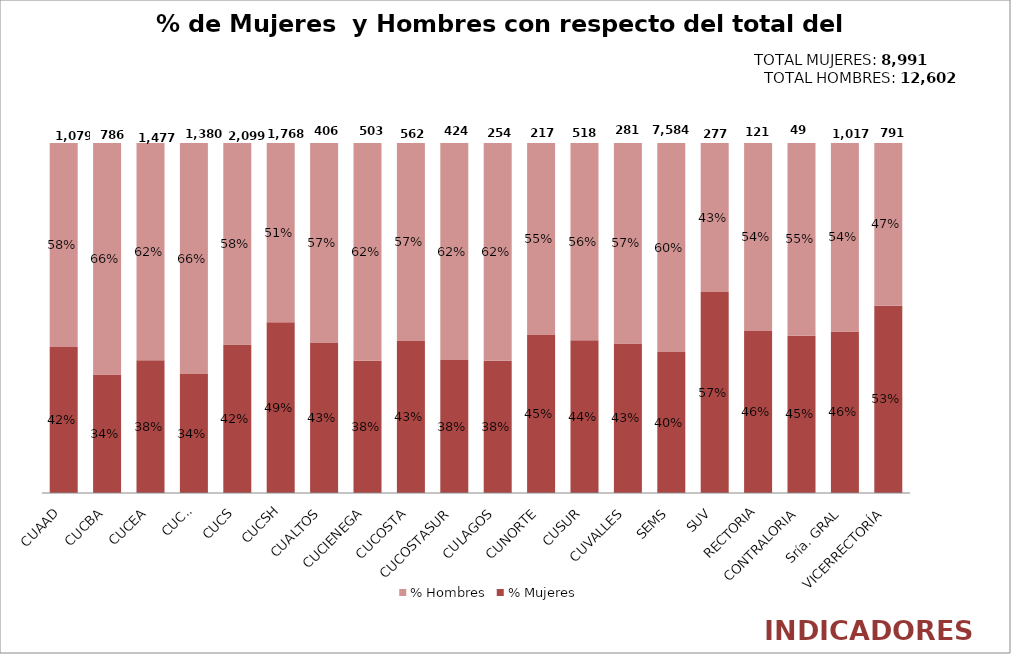
| Category | % Mujeres | % Hombres |
|---|---|---|
| CUAAD | 0.417 | 0.583 |
| CUCBA | 0.338 | 0.662 |
| CUCEA | 0.379 | 0.621 |
| CUCEI | 0.34 | 0.66 |
| CUCS | 0.424 | 0.576 |
| CUCSH | 0.488 | 0.512 |
| CUALTOS | 0.429 | 0.571 |
| CUCIENEGA | 0.378 | 0.622 |
| CUCOSTA | 0.434 | 0.566 |
| CUCOSTASUR | 0.38 | 0.62 |
| CULAGOS | 0.378 | 0.622 |
| CUNORTE | 0.452 | 0.548 |
| CUSUR | 0.436 | 0.564 |
| CUVALLES | 0.427 | 0.573 |
| SEMS | 0.403 | 0.597 |
| SUV | 0.574 | 0.426 |
| RECTORIA | 0.463 | 0.537 |
| CONTRALORIA | 0.449 | 0.551 |
| Sría. GRAL | 0.461 | 0.539 |
| VICERRECTORÍA | 0.535 | 0.465 |